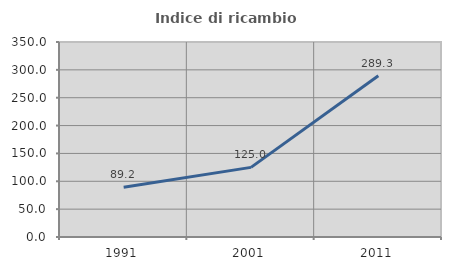
| Category | Indice di ricambio occupazionale  |
|---|---|
| 1991.0 | 89.231 |
| 2001.0 | 125 |
| 2011.0 | 289.286 |